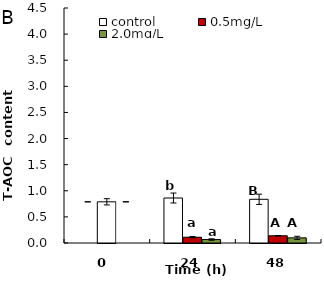
| Category | control | 0.5mg/L | 2.0mg/L |
|---|---|---|---|
| 0.0 | 0.789 | 0.789 | 0.789 |
| 24.0 | 0.861 | 0.111 | 0.066 |
| 48.0 | 0.837 | 0.138 | 0.099 |